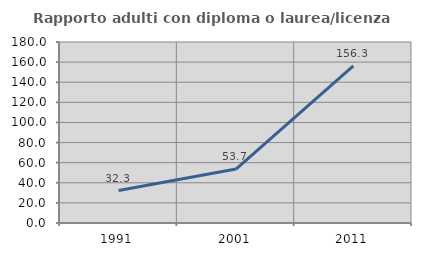
| Category | Rapporto adulti con diploma o laurea/licenza media  |
|---|---|
| 1991.0 | 32.308 |
| 2001.0 | 53.659 |
| 2011.0 | 156.25 |